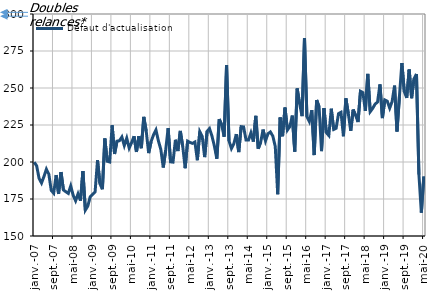
| Category | Défaut d'actualisation |
|---|---|
| 2007-01-01 | 199.9 |
| 2007-02-01 | 197.4 |
| 2007-03-01 | 188.9 |
| 2007-04-01 | 185.8 |
| 2007-05-01 | 190.2 |
| 2007-06-01 | 195.1 |
| 2007-07-01 | 191.8 |
| 2007-08-01 | 180.8 |
| 2007-09-01 | 178.9 |
| 2007-10-01 | 191.2 |
| 2007-11-01 | 178.4 |
| 2007-12-01 | 193.2 |
| 2008-01-01 | 181.1 |
| 2008-02-01 | 179.9 |
| 2008-03-01 | 178.8 |
| 2008-04-01 | 183.8 |
| 2008-05-01 | 177.5 |
| 2008-06-01 | 173.8 |
| 2008-07-01 | 178.5 |
| 2008-08-01 | 173.9 |
| 2008-09-01 | 193.8 |
| 2008-10-01 | 167.5 |
| 2008-11-01 | 170.2 |
| 2008-12-01 | 176.5 |
| 2009-01-01 | 178.2 |
| 2009-02-01 | 179.8 |
| 2009-03-01 | 201.2 |
| 2009-04-01 | 185.3 |
| 2009-05-01 | 181.6 |
| 2009-06-01 | 215.9 |
| 2009-07-01 | 200.5 |
| 2009-08-01 | 200 |
| 2009-09-01 | 224.8 |
| 2009-10-01 | 205.4 |
| 2009-11-01 | 214.1 |
| 2009-12-01 | 214.4 |
| 2010-01-01 | 216.9 |
| 2010-02-01 | 211.1 |
| 2010-03-01 | 216.1 |
| 2010-04-01 | 209.4 |
| 2010-05-01 | 213.1 |
| 2010-06-01 | 217.4 |
| 2010-07-01 | 206.8 |
| 2010-08-01 | 217.5 |
| 2010-09-01 | 209.3 |
| 2010-10-01 | 230.5 |
| 2010-11-01 | 220.9 |
| 2010-12-01 | 206 |
| 2011-01-01 | 213.8 |
| 2011-02-01 | 218.3 |
| 2011-03-01 | 221.6 |
| 2011-04-01 | 214.3 |
| 2011-05-01 | 208.5 |
| 2011-06-01 | 196.3 |
| 2011-07-01 | 208.1 |
| 2011-08-01 | 222.9 |
| 2011-09-01 | 200.1 |
| 2011-10-01 | 199.9 |
| 2011-11-01 | 215 |
| 2011-12-01 | 207.4 |
| 2012-01-01 | 221 |
| 2012-02-01 | 210.5 |
| 2012-03-01 | 195.8 |
| 2012-04-01 | 214.1 |
| 2012-05-01 | 213.2 |
| 2012-06-01 | 212.6 |
| 2012-07-01 | 213.5 |
| 2012-08-01 | 201.2 |
| 2012-09-01 | 220.5 |
| 2012-10-01 | 217.3 |
| 2012-11-01 | 203.3 |
| 2012-12-01 | 220.7 |
| 2013-01-01 | 222.6 |
| 2013-02-01 | 217.5 |
| 2013-03-01 | 210.8 |
| 2013-04-01 | 202.2 |
| 2013-05-01 | 229 |
| 2013-06-01 | 225 |
| 2013-07-01 | 217.1 |
| 2013-08-01 | 265.5 |
| 2013-09-01 | 214.3 |
| 2013-10-01 | 209.1 |
| 2013-11-01 | 212.4 |
| 2013-12-01 | 218.8 |
| 2014-01-01 | 206.7 |
| 2014-02-01 | 223.9 |
| 2014-03-01 | 223.7 |
| 2014-04-01 | 214.8 |
| 2014-05-01 | 214.8 |
| 2014-06-01 | 219.7 |
| 2014-07-01 | 213.8 |
| 2014-08-01 | 231.2 |
| 2014-09-01 | 209 |
| 2014-10-01 | 213.3 |
| 2014-11-01 | 221.9 |
| 2014-12-01 | 214.3 |
| 2015-01-01 | 219.1 |
| 2015-02-01 | 220.3 |
| 2015-03-01 | 217.5 |
| 2015-04-01 | 210.5 |
| 2015-05-01 | 178.2 |
| 2015-06-01 | 230.1 |
| 2015-07-01 | 217.4 |
| 2015-08-01 | 236.8 |
| 2015-09-01 | 221.6 |
| 2015-10-01 | 224 |
| 2015-11-01 | 231.4 |
| 2015-12-01 | 207 |
| 2016-01-01 | 249.7 |
| 2016-02-01 | 239.5 |
| 2016-03-01 | 231 |
| 2016-04-01 | 283.8 |
| 2016-05-01 | 230.6 |
| 2016-06-01 | 227.3 |
| 2016-07-01 | 235 |
| 2016-08-01 | 204.7 |
| 2016-09-01 | 241.9 |
| 2016-10-01 | 237.3 |
| 2016-11-01 | 207.3 |
| 2016-12-01 | 236.4 |
| 2017-01-01 | 219.8 |
| 2017-02-01 | 217.9 |
| 2017-03-01 | 236 |
| 2017-04-01 | 222 |
| 2017-05-01 | 222.8 |
| 2017-06-01 | 232.7 |
| 2017-07-01 | 233.6 |
| 2017-08-01 | 217.4 |
| 2017-09-01 | 243 |
| 2017-10-01 | 232.8 |
| 2017-11-01 | 221 |
| 2017-12-01 | 235.4 |
| 2018-01-01 | 231.5 |
| 2018-02-01 | 227 |
| 2018-03-01 | 247.8 |
| 2018-04-01 | 246.9 |
| 2018-05-01 | 234.6 |
| 2018-06-01 | 259.5 |
| 2018-07-01 | 234 |
| 2018-08-01 | 236.2 |
| 2018-09-01 | 239.1 |
| 2018-10-01 | 240.5 |
| 2018-11-01 | 252.4 |
| 2018-12-01 | 229.7 |
| 2019-01-01 | 241.9 |
| 2019-02-01 | 241.1 |
| 2019-03-01 | 236.4 |
| 2019-04-01 | 240.9 |
| 2019-05-01 | 251.6 |
| 2019-06-01 | 220.6 |
| 2019-07-01 | 244.4 |
| 2019-08-01 | 266.9 |
| 2019-09-01 | 247.6 |
| 2019-10-01 | 243.3 |
| 2019-11-01 | 262.5 |
| 2019-12-01 | 243.1 |
| 2020-01-01 | 256.3 |
| 2020-02-01 | 259.5 |
| 2020-03-01 | 191.6 |
| 2020-04-01 | 165.8 |
| 2020-05-01 | 190.2 |